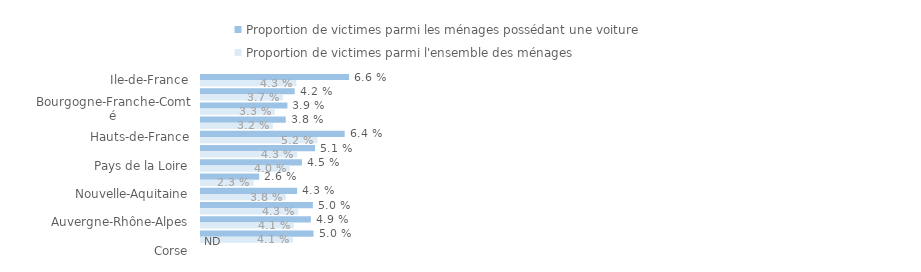
| Category | Proportion de victimes parmi les ménages possédant une voiture | Proportion de victimes parmi l'ensemble des ménages |
|---|---|---|
| Ile-de-France | 0.066 | 0.043 |
| Centre-Val de Loire | 0.042 | 0.037 |
| Bourgogne-Franche-Comté | 0.039 | 0.033 |
| Normandie | 0.038 | 0.032 |
| Hauts-de-France | 0.064 | 0.052 |
| Grand Est | 0.051 | 0.043 |
| Pays de la Loire | 0.045 | 0.04 |
| Bretagne | 0.026 | 0.023 |
| Nouvelle-Aquitaine | 0.043 | 0.038 |
| Occitanie | 0.05 | 0.043 |
| Auvergne-Rhône-Alpes | 0.049 | 0.041 |
| Provence-Alpes-Côte d'Azur | 0.05 | 0.041 |
| Corse | 0 | 0 |